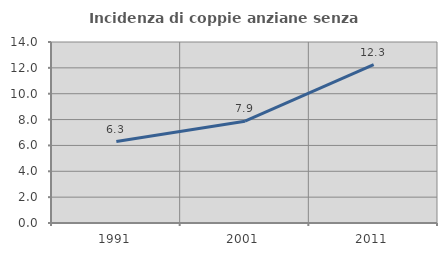
| Category | Incidenza di coppie anziane senza figli  |
|---|---|
| 1991.0 | 6.297 |
| 2001.0 | 7.874 |
| 2011.0 | 12.254 |